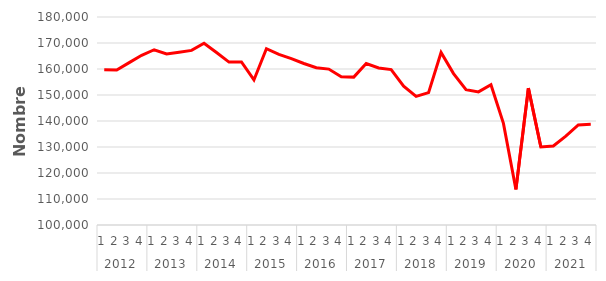
| Category | Série CVS-CJO * |
|---|---|
| 0 | 159737.246 |
| 1 | 159592.139 |
| 2 | 162442.797 |
| 3 | 165264.518 |
| 4 | 167409.059 |
| 5 | 165770.624 |
| 6 | 166435.837 |
| 7 | 167148.281 |
| 8 | 169916.871 |
| 9 | 166361.108 |
| 10 | 162665.658 |
| 11 | 162718.02 |
| 12 | 155788.75 |
| 13 | 167794.96 |
| 14 | 165588.083 |
| 15 | 164021.422 |
| 16 | 162118.324 |
| 17 | 160467.571 |
| 18 | 159966.851 |
| 19 | 156992.219 |
| 20 | 156878.674 |
| 21 | 162092.532 |
| 22 | 160417.811 |
| 23 | 159759.345 |
| 24 | 153412.809 |
| 25 | 149469.085 |
| 26 | 150926.878 |
| 27 | 166355.844 |
| 28 | 158234.68 |
| 29 | 152064.471 |
| 30 | 151184.22 |
| 31 | 153937.945 |
| 32 | 139086.694 |
| 33 | 113687.305 |
| 34 | 152627.698 |
| 35 | 129998.684 |
| 36 | 130372.383 |
| 37 | 134157.726 |
| 38 | 138488 |
| 39 | 138782.908 |